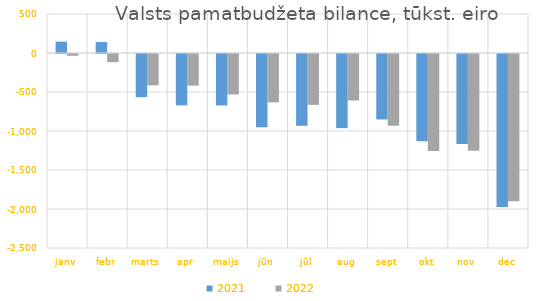
| Category | 2021 | 2022 |
|---|---|---|
| janv | 145495.451 | -22576.613 |
| febr | 140973.019 | -104207.657 |
| marts | -553552.963 | -401343.883 |
| apr | -658430.761 | -406432.786 |
| maijs | -659587.172 | -518798.917 |
| jūn | -939419.413 | -620133.729 |
| jūl | -920391.102 | -652119.984 |
| aug | -950438.335 | -596051.014 |
| sept | -838941.258 | -919146.823 |
| okt | -1117742.949 | -1242437.213 |
| nov | -1155026.676 | -1239928.794 |
| dec | -1960876.794 | -1889248.09 |